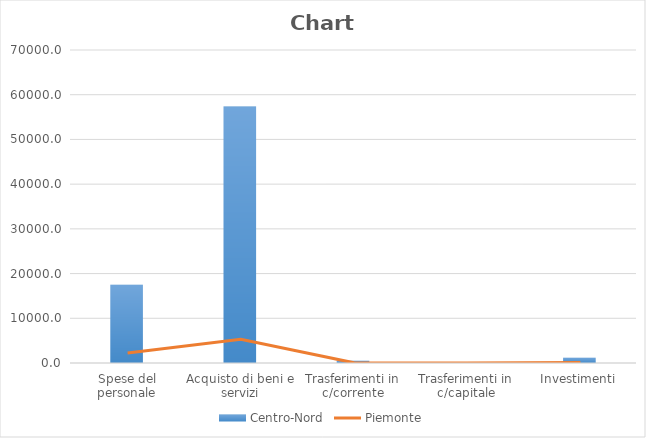
| Category | Centro-Nord |
|---|---|
| Spese del personale | 17474.898 |
| Acquisto di beni e servizi | 57361.569 |
| Trasferimenti in c/corrente | 521.07 |
| Trasferimenti in c/capitale | 32.472 |
| Investimenti | 1155.171 |